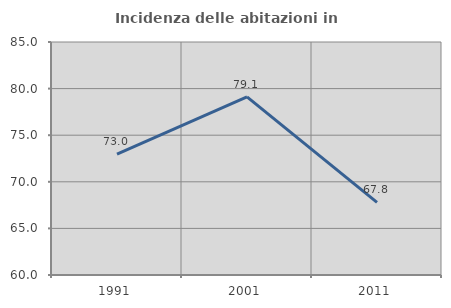
| Category | Incidenza delle abitazioni in proprietà  |
|---|---|
| 1991.0 | 72.981 |
| 2001.0 | 79.108 |
| 2011.0 | 67.793 |